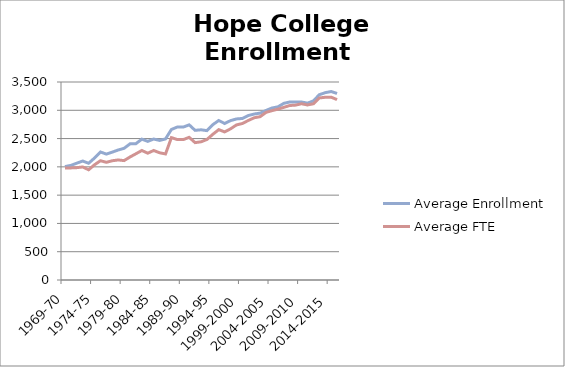
| Category | Average Enrollment | Average FTE |
|---|---|---|
| 1969-70 | 2005.5 | 1982 |
| 1970-71 | 2026 | 1981.5 |
| 1971-72 | 2065 | 1986 |
| 1972-73 | 2103 | 1998 |
| 1973-74 | 2063.5 | 1948.5 |
| 1974-75 | 2156 | 2037 |
| 1975-76 | 2263 | 2108 |
| 1976-77 | 2225.5 | 2080.5 |
| 1977-78 | 2260.5 | 2108 |
| 1978-79 | 2298 | 2122 |
| 1979-80 | 2327.5 | 2110.5 |
| 1980-81 | 2407 | 2174.5 |
| 1981-82 | 2410 | 2231.5 |
| 1982-83 | 2490 | 2289.2 |
| 1983-84 | 2450.5 | 2241.5 |
| 1984-85 | 2492 | 2289.6 |
| 1985-86 | 2467.5 | 2248.75 |
| 1986-87 | 2493.5 | 2227.75 |
| 1987-88 | 2661 | 2516.45 |
| 1988-89 | 2704.5 | 2482.1 |
| 1989-90 | 2703 | 2481.5 |
| 1990-91 | 2742.5 | 2522.1 |
| 1991-92 | 2645.5 | 2428.25 |
| 1992-93 | 2655 | 2442.75 |
| 1993-94 | 2640.5 | 2483.95 |
| 1994-95 | 2746 | 2575.2 |
| 1995-96 | 2819.5 | 2657.95 |
| 1996-97 | 2767 | 2617.55 |
| 1997-98 | 2817.5 | 2672.45 |
| 1998-99 | 2847 | 2741.2 |
| 1999-2000 | 2855.5 | 2766.5 |
| 2000-2001 | 2907.5 | 2820.25 |
| 2001-2002 | 2934 | 2867.8 |
| 2002-2003 | 2950 | 2886.9 |
| 2003-2004 | 2997.5 | 2963.15 |
| 2004-2005 | 3040.5 | 2993.6 |
| 2005-2006 | 3060.5 | 3019.1 |
| 2006-2007 | 3123 | 3052.15 |
| 2007-2008 | 3146.5 | 3084.2 |
| 2008-2009 | 3148.5 | 3091.5 |
| 2009-2010 | 3146.5 | 3115.9 |
| 2010-2011 | 3126 | 3093.9 |
| 2011-2012 | 3166 | 3115.15 |
| 2012-2013 | 3275 | 3217.9 |
| 2013-2014 | 3311.5 | 3229.8 |
| 2014-2015 | 3331.5 | 3232.05 |
| 2015-2016 | 3297 | 3188.75 |